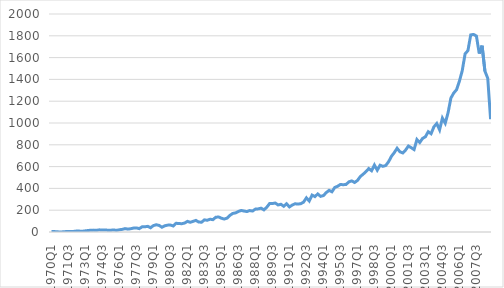
| Category | Billions |
|---|---|
| 1970Q1 | 4.267 |
| 1970Q2 | 4.174 |
| 1970Q3 | 2.049 |
| 1970Q4 | 0.138 |
| 1971Q1 | 1.308 |
| 1971Q2 | 3.579 |
| 1971Q3 | 3.499 |
| 1971Q4 | 3.653 |
| 1972Q1 | 5.993 |
| 1972Q2 | 9.05 |
| 1972Q3 | 7.974 |
| 1972Q4 | 7.028 |
| 1973Q1 | 10.786 |
| 1973Q2 | 14.007 |
| 1973Q3 | 16.354 |
| 1973Q4 | 17.242 |
| 1974Q1 | 15.878 |
| 1974Q2 | 19.619 |
| 1974Q3 | 18.633 |
| 1974Q4 | 17.809 |
| 1975Q1 | 16.753 |
| 1975Q2 | 16.624 |
| 1975Q3 | 18.877 |
| 1975Q4 | 15.012 |
| 1976Q1 | 20.601 |
| 1976Q2 | 24.102 |
| 1976Q3 | 31.07 |
| 1976Q4 | 26.363 |
| 1977Q1 | 30.205 |
| 1977Q2 | 35.999 |
| 1977Q3 | 37.572 |
| 1977Q4 | 30.964 |
| 1978Q1 | 47.331 |
| 1978Q2 | 48.079 |
| 1978Q3 | 51.769 |
| 1978Q4 | 39.167 |
| 1979Q1 | 58.94 |
| 1979Q2 | 66.454 |
| 1979Q3 | 60.649 |
| 1979Q4 | 44.012 |
| 1980Q1 | 56.67 |
| 1980Q2 | 63.02 |
| 1980Q3 | 63.722 |
| 1980Q4 | 55.418 |
| 1981Q1 | 79.862 |
| 1981Q2 | 77.834 |
| 1981Q3 | 76.103 |
| 1981Q4 | 82.11 |
| 1982Q1 | 97.381 |
| 1982Q2 | 88.694 |
| 1982Q3 | 97.451 |
| 1982Q4 | 106.337 |
| 1983Q1 | 91.239 |
| 1983Q2 | 90.049 |
| 1983Q3 | 111.287 |
| 1983Q4 | 107.626 |
| 1984Q1 | 117.226 |
| 1984Q2 | 113.142 |
| 1984Q3 | 135.176 |
| 1984Q4 | 138.02 |
| 1985Q1 | 126.327 |
| 1985Q2 | 118.808 |
| 1985Q3 | 127.468 |
| 1985Q4 | 152.921 |
| 1986Q1 | 170.368 |
| 1986Q2 | 175.352 |
| 1986Q3 | 188.626 |
| 1986Q4 | 197.529 |
| 1987Q1 | 192.248 |
| 1987Q2 | 187.667 |
| 1987Q3 | 196.74 |
| 1987Q4 | 192.365 |
| 1988Q1 | 210.203 |
| 1988Q2 | 212.38 |
| 1988Q3 | 218.467 |
| 1988Q4 | 203.195 |
| 1989Q1 | 226.955 |
| 1989Q2 | 260.71 |
| 1989Q3 | 261.229 |
| 1989Q4 | 265.821 |
| 1990Q1 | 248.022 |
| 1990Q2 | 254.383 |
| 1990Q3 | 235.822 |
| 1990Q4 | 259.231 |
| 1991Q1 | 229.981 |
| 1991Q2 | 247.012 |
| 1991Q3 | 259.075 |
| 1991Q4 | 256.326 |
| 1992Q1 | 259.569 |
| 1992Q2 | 274.205 |
| 1992Q3 | 313.245 |
| 1992Q4 | 284.335 |
| 1993Q1 | 338.673 |
| 1993Q2 | 324.684 |
| 1993Q3 | 349.118 |
| 1993Q4 | 327.079 |
| 1994Q1 | 334.261 |
| 1994Q2 | 361.732 |
| 1994Q3 | 381.68 |
| 1994Q4 | 368.618 |
| 1995Q1 | 408.623 |
| 1995Q2 | 419.44 |
| 1995Q3 | 436.524 |
| 1995Q4 | 433.619 |
| 1996Q1 | 436.354 |
| 1996Q2 | 460.182 |
| 1996Q3 | 468.611 |
| 1996Q4 | 454.481 |
| 1997Q1 | 472.165 |
| 1997Q2 | 508.176 |
| 1997Q3 | 529.799 |
| 1997Q4 | 553.646 |
| 1998Q1 | 581.756 |
| 1998Q2 | 562.186 |
| 1998Q3 | 614.324 |
| 1998Q4 | 567.375 |
| 1999Q1 | 612.691 |
| 1999Q2 | 602.289 |
| 1999Q3 | 610.317 |
| 1999Q4 | 644.529 |
| 2000Q1 | 693.729 |
| 2000Q2 | 727.929 |
| 2000Q3 | 768.194 |
| 2000Q4 | 735.73 |
| 2001Q1 | 725.442 |
| 2001Q2 | 751.806 |
| 2001Q3 | 788.735 |
| 2001Q4 | 773.401 |
| 2002Q1 | 756.432 |
| 2002Q2 | 848.172 |
| 2002Q3 | 821.205 |
| 2002Q4 | 858.731 |
| 2003Q1 | 873.931 |
| 2003Q2 | 920.009 |
| 2003Q3 | 901.807 |
| 2003Q4 | 965.037 |
| 2004Q1 | 995.174 |
| 2004Q2 | 937.39 |
| 2004Q3 | 1044.784 |
| 2004Q4 | 997.939 |
| 2005Q1 | 1095.391 |
| 2005Q2 | 1229.306 |
| 2005Q3 | 1275.422 |
| 2005Q4 | 1305.902 |
| 2006Q1 | 1384.313 |
| 2006Q2 | 1479.911 |
| 2006Q3 | 1634.488 |
| 2006Q4 | 1664.292 |
| 2007Q1 | 1808.396 |
| 2007Q2 | 1812.505 |
| 2007Q3 | 1797.961 |
| 2007Q4 | 1636.911 |
| 2008Q1 | 1709.157 |
| 2008Q2 | 1476.023 |
| 2008Q3 | 1410.785 |
| 2008Q4 | 1034.938 |